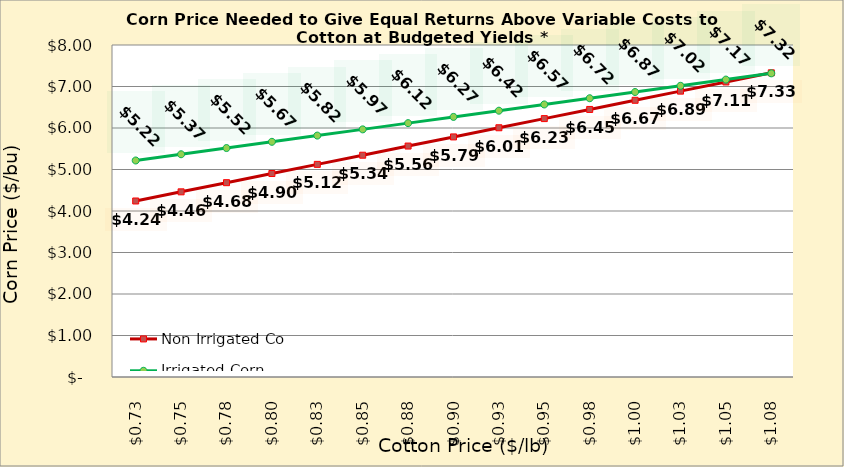
| Category | Non Irrigated Corn | Irrigated Corn |
|---|---|---|
| 0.7249999999999999 | 4.241 | 5.217 |
| 0.7499999999999999 | 4.462 | 5.367 |
| 0.7749999999999999 | 4.682 | 5.517 |
| 0.7999999999999999 | 4.903 | 5.667 |
| 0.825 | 5.124 | 5.817 |
| 0.85 | 5.344 | 5.967 |
| 0.875 | 5.565 | 6.117 |
| 0.9 | 5.785 | 6.267 |
| 0.925 | 6.006 | 6.417 |
| 0.9500000000000001 | 6.227 | 6.567 |
| 0.9750000000000001 | 6.447 | 6.717 |
| 1.0 | 6.668 | 6.867 |
| 1.025 | 6.888 | 7.017 |
| 1.0499999999999998 | 7.109 | 7.167 |
| 1.0749999999999997 | 7.33 | 7.317 |